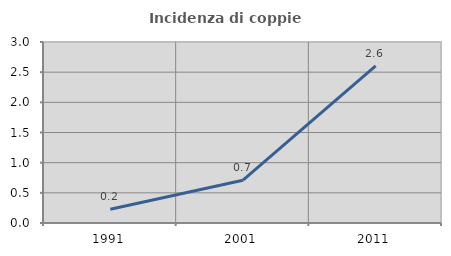
| Category | Incidenza di coppie miste |
|---|---|
| 1991.0 | 0.227 |
| 2001.0 | 0.709 |
| 2011.0 | 2.604 |